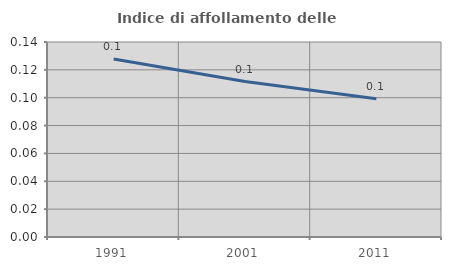
| Category | Indice di affollamento delle abitazioni  |
|---|---|
| 1991.0 | 0.128 |
| 2001.0 | 0.112 |
| 2011.0 | 0.099 |